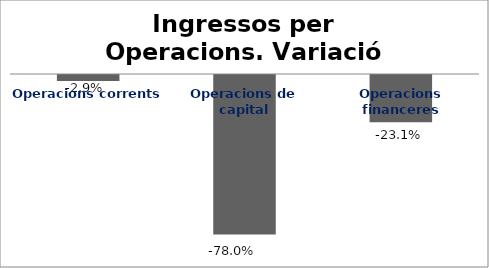
| Category | Series 0 |
|---|---|
| Operacions corrents | -0.029 |
| Operacions de capital | -0.78 |
| Operacions financeres | -0.231 |